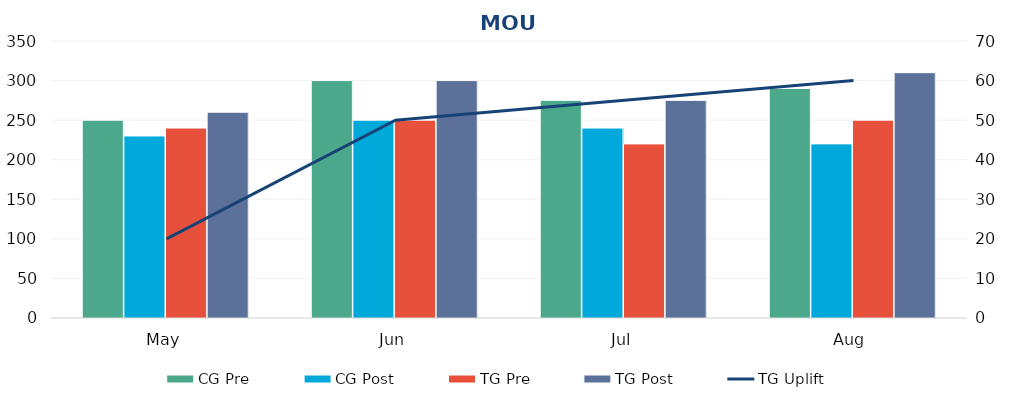
| Category | CG Pre | CG Post | TG Pre | TG Post |
|---|---|---|---|---|
| May | 250 | 230 | 240 | 260 |
| Jun | 300 | 250 | 250 | 300 |
| Jul | 275 | 240 | 220 | 275 |
| Aug | 290 | 220 | 250 | 310 |